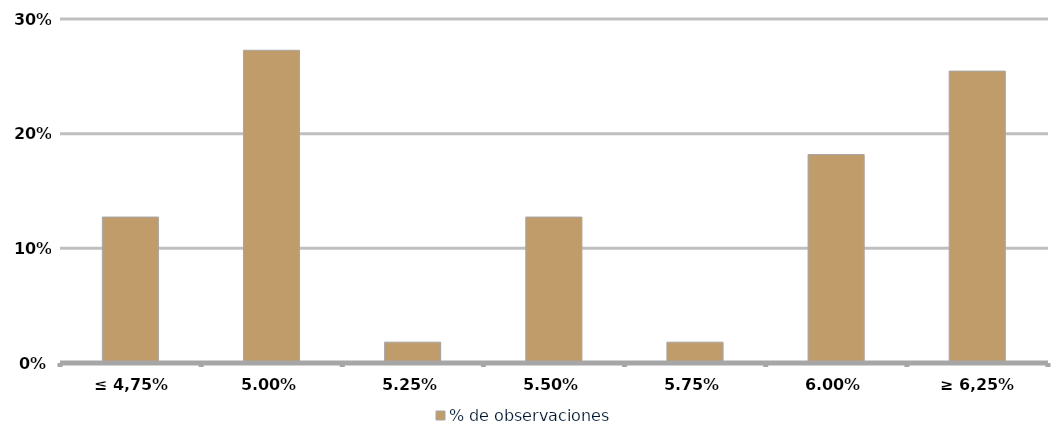
| Category | % de observaciones  |
|---|---|
| ≤ 4,75% | 0.127 |
| 5,00% | 0.273 |
| 5,25% | 0.018 |
| 5,50% | 0.127 |
| 5,75% | 0.018 |
| 6,00% | 0.182 |
| ≥ 6,25% | 0.255 |